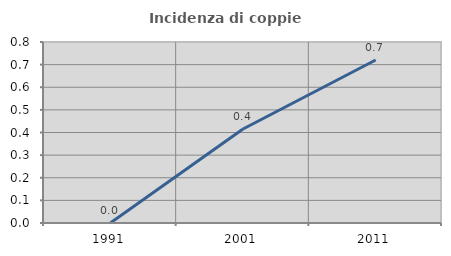
| Category | Incidenza di coppie miste |
|---|---|
| 1991.0 | 0 |
| 2001.0 | 0.416 |
| 2011.0 | 0.72 |